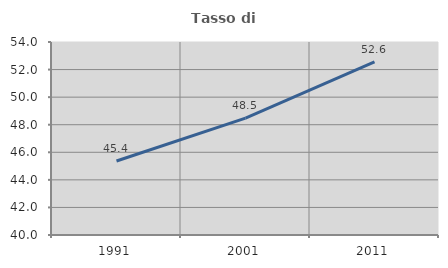
| Category | Tasso di occupazione   |
|---|---|
| 1991.0 | 45.371 |
| 2001.0 | 48.475 |
| 2011.0 | 52.555 |